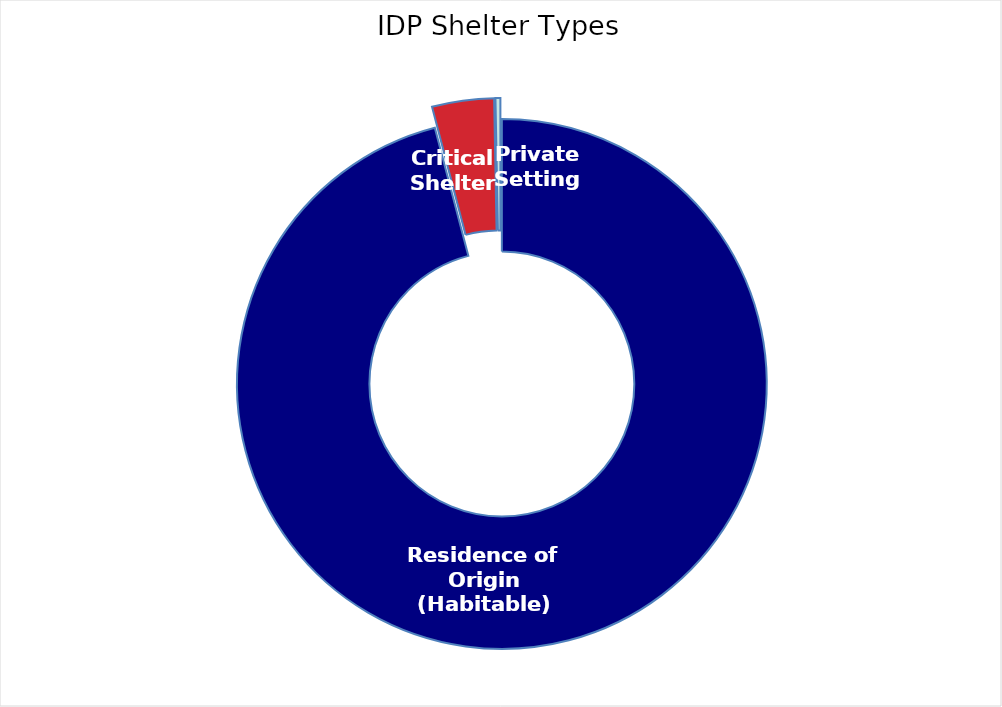
| Category | Individuals |
|---|---|
| Residence of Origin (Habitable) | 4685700 |
| Critical Shelter | 184368 |
| Private Setting | 14544 |